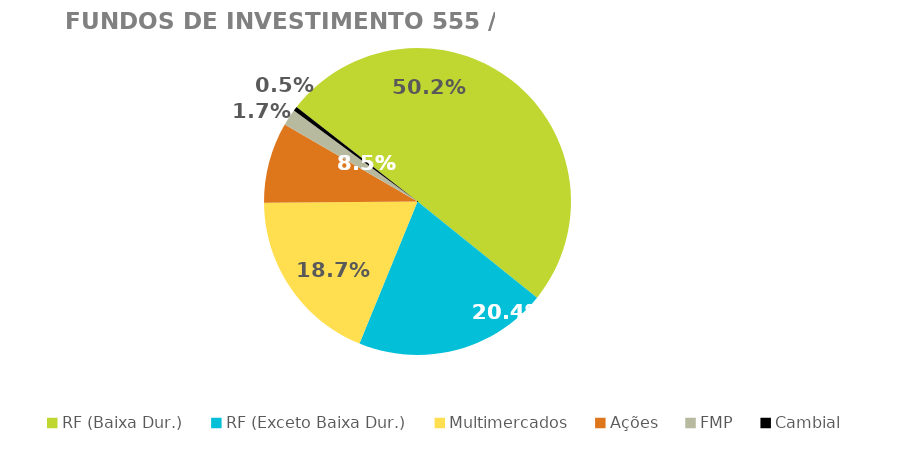
| Category | Fundos de Investimento 555 / FMP |
|---|---|
| RF (Baixa Dur.) | 0.502 |
| RF (Exceto Baixa Dur.) | 0.204 |
| Multimercados | 0.187 |
| Ações | 0.085 |
| FMP | 0.017 |
| Cambial | 0.005 |